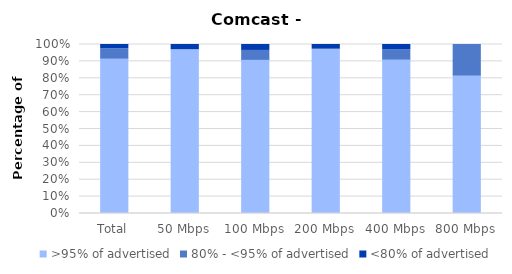
| Category | >95% of advertised | 80% - <95% of advertised | <80% of advertised |
|---|---|---|---|
| Total | 0.92 | 0.054 | 0.026 |
| 50 Mbps | 0.97 | 0 | 0.03 |
| 100 Mbps | 0.912 | 0.053 | 0.035 |
| 200 Mbps | 0.972 | 0 | 0.028 |
| 400 Mbps | 0.914 | 0.054 | 0.032 |
| 800 Mbps | 0.82 | 0.18 | 0 |